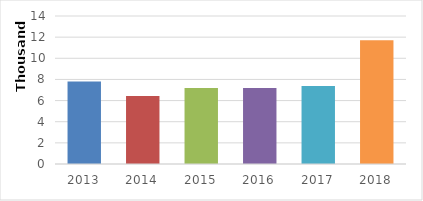
| Category | SERVICIOS TECNOLÓGICOS PROPORCIONADOS |
|---|---|
| 2013.0 | 7799 |
| 2014.0 | 6423 |
| 2015.0 | 7197 |
| 2016.0 | 7200 |
| 2017.0 | 7369 |
| 2018.0 | 11712 |